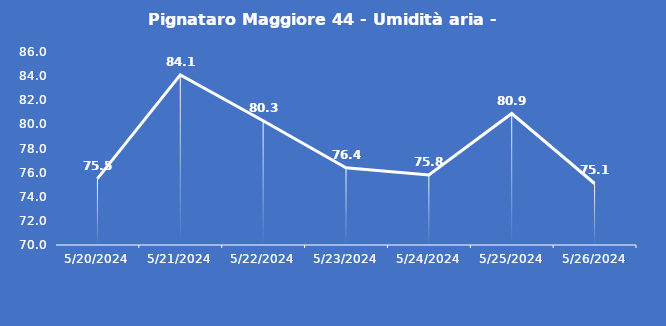
| Category | Pignataro Maggiore 44 - Umidità aria - Grezzo (%) |
|---|---|
| 5/20/24 | 75.5 |
| 5/21/24 | 84.1 |
| 5/22/24 | 80.3 |
| 5/23/24 | 76.4 |
| 5/24/24 | 75.8 |
| 5/25/24 | 80.9 |
| 5/26/24 | 75.1 |